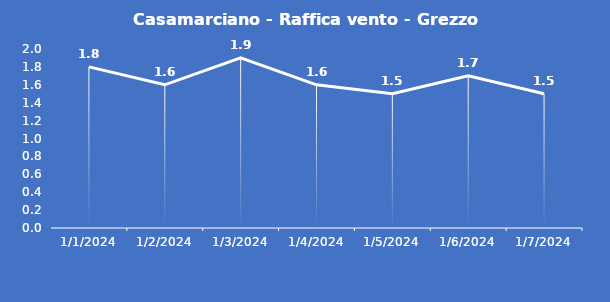
| Category | Casamarciano - Raffica vento - Grezzo (m/s) |
|---|---|
| 1/1/24 | 1.8 |
| 1/2/24 | 1.6 |
| 1/3/24 | 1.9 |
| 1/4/24 | 1.6 |
| 1/5/24 | 1.5 |
| 1/6/24 | 1.7 |
| 1/7/24 | 1.5 |